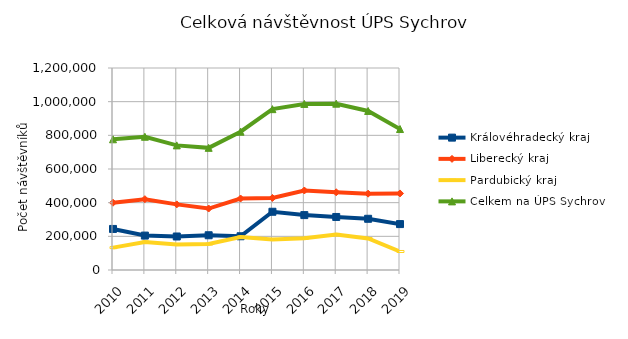
| Category | Královéhradecký kraj | Liberecký kraj | Pardubický kraj | Celkem na ÚPS Sychrov |
|---|---|---|---|---|
| 2010.0 | 243910 | 399672 | 133004 | 776586 |
| 2011.0 | 204481 | 420780 | 166238 | 791499 |
| 2012.0 | 199025 | 389781 | 151509 | 740315 |
| 2013.0 | 206419 | 365108 | 154165 | 725692 |
| 2014.0 | 200438 | 424718 | 196473 | 821629 |
| 2015.0 | 345970 | 428023 | 181567 | 955560 |
| 2016.0 | 326137 | 472318 | 188108 | 986563 |
| 2017.0 | 314983 | 461803 | 211268 | 988054 |
| 2018.0 | 304267 | 453568 | 187017 | 944852 |
| 2019.0 | 272720 | 454785 | 109949 | 837454 |